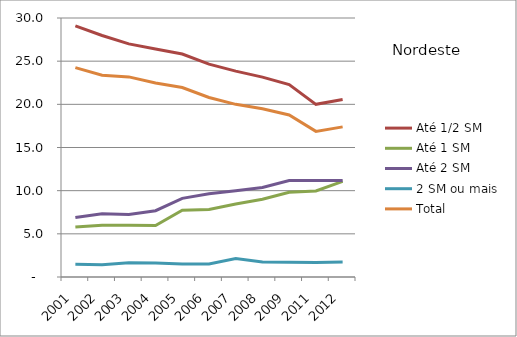
| Category | Até 1/2 SM | Até 1 SM | Até 2 SM | 2 SM ou mais | Total |
|---|---|---|---|---|---|
| 2001 | 29.09 | 5.79 | 6.88 | 1.48 | 24.25 |
| 2002 | 27.97 | 5.99 | 7.33 | 1.42 | 23.38 |
| 2003 | 27 | 5.98 | 7.23 | 1.64 | 23.18 |
| 2004 | 26.4 | 5.97 | 7.68 | 1.61 | 22.47 |
| 2005 | 25.83 | 7.74 | 9.11 | 1.5 | 21.95 |
| 2006 | 24.65 | 7.81 | 9.64 | 1.51 | 20.79 |
| 2007 | 23.85 | 8.45 | 9.98 | 2.13 | 20 |
| 2008 | 23.15 | 9.01 | 10.36 | 1.73 | 19.48 |
| 2009 | 22.29 | 9.82 | 11.17 | 1.72 | 18.77 |
| 2011 | 20 | 9.97 | 11.17 | 1.67 | 16.87 |
| 2012 | 20.55 | 11.07 | 11.17 | 1.73 | 17.39 |